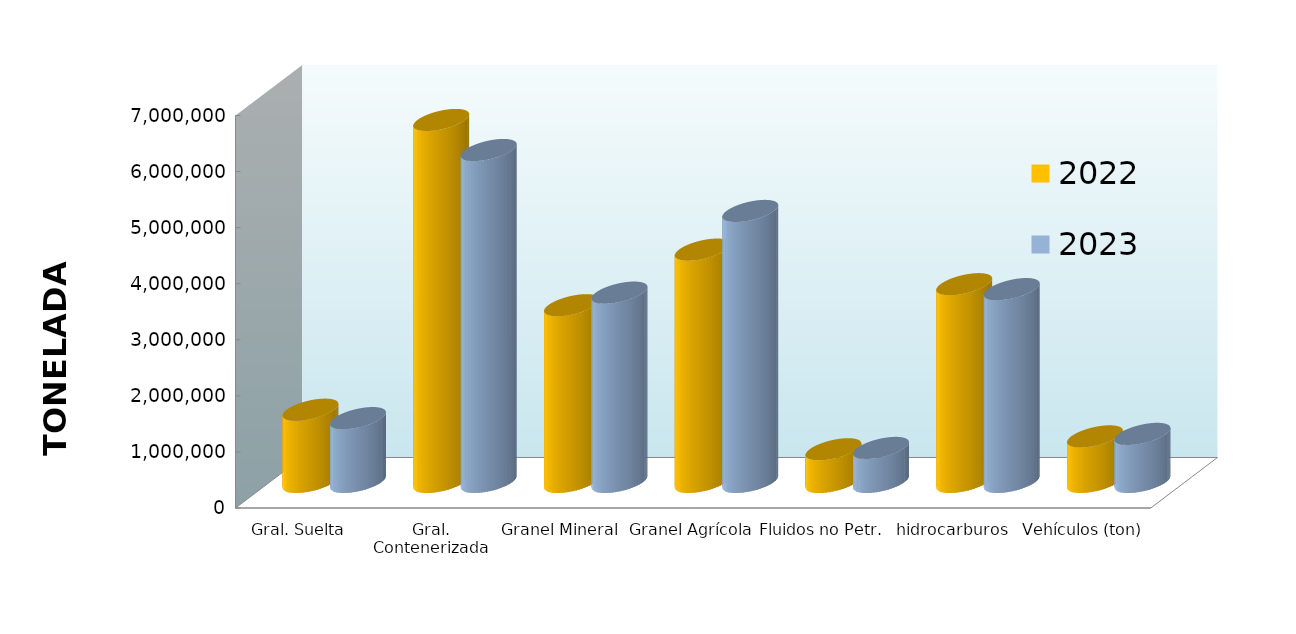
| Category | 2022 | 2023 |
|---|---|---|
| Gral. Suelta | 1289818.968 | 1139496.679 |
| Gral. Contenerizada | 6456773.621 | 5921168.533 |
| Granel Mineral | 3153132.726 | 3377600.649 |
| Granel Agrícola | 4144698.272 | 4834186.472 |
| Fluidos no Petr. | 584163.624 | 607848.189 |
| hidrocarburos | 3527925.379 | 3440327.205 |
| Vehículos (ton) | 813795.181 | 858230.603 |